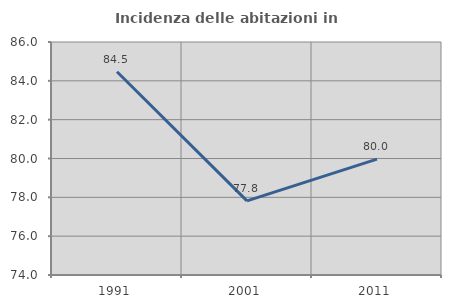
| Category | Incidenza delle abitazioni in proprietà  |
|---|---|
| 1991.0 | 84.466 |
| 2001.0 | 77.815 |
| 2011.0 | 79.968 |